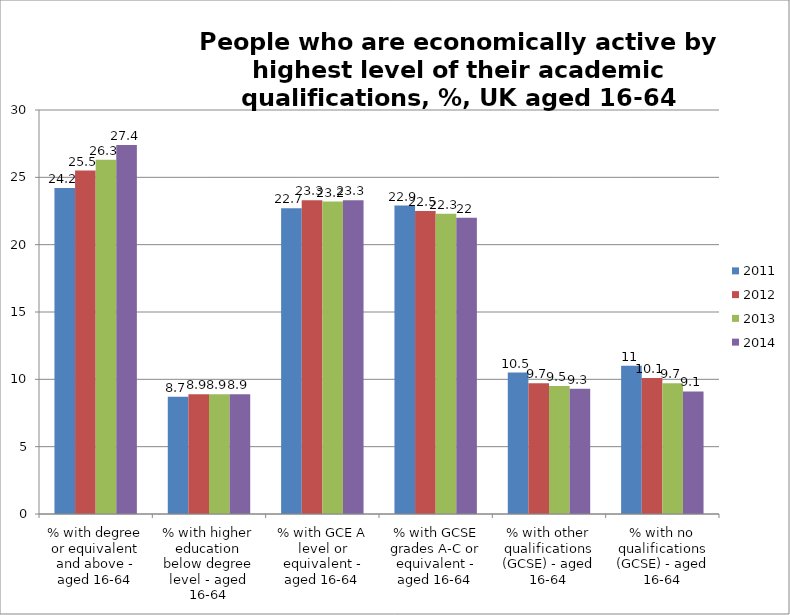
| Category | 2011 | 2012 | 2013 | 2014 |
|---|---|---|---|---|
| % with degree or equivalent and above - aged 16-64 | 24.2 | 25.5 | 26.3 | 27.4 |
| % with higher education below degree level - aged 16-64 | 8.7 | 8.9 | 8.9 | 8.9 |
| % with GCE A level or equivalent - aged 16-64 | 22.7 | 23.3 | 23.2 | 23.3 |
| % with GCSE grades A-C or equivalent - aged 16-64 | 22.9 | 22.5 | 22.3 | 22 |
| % with other qualifications (GCSE) - aged 16-64 | 10.5 | 9.7 | 9.5 | 9.3 |
| % with no qualifications (GCSE) - aged 16-64 | 11 | 10.1 | 9.7 | 9.1 |